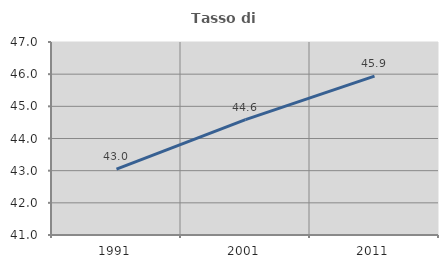
| Category | Tasso di occupazione   |
|---|---|
| 1991.0 | 43.046 |
| 2001.0 | 44.588 |
| 2011.0 | 45.937 |